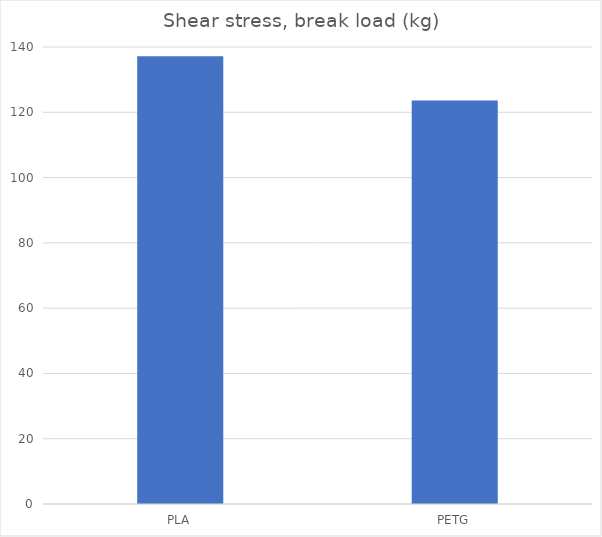
| Category | Break kg |
|---|---|
| PLA | 137.2 |
| PETG | 123.6 |